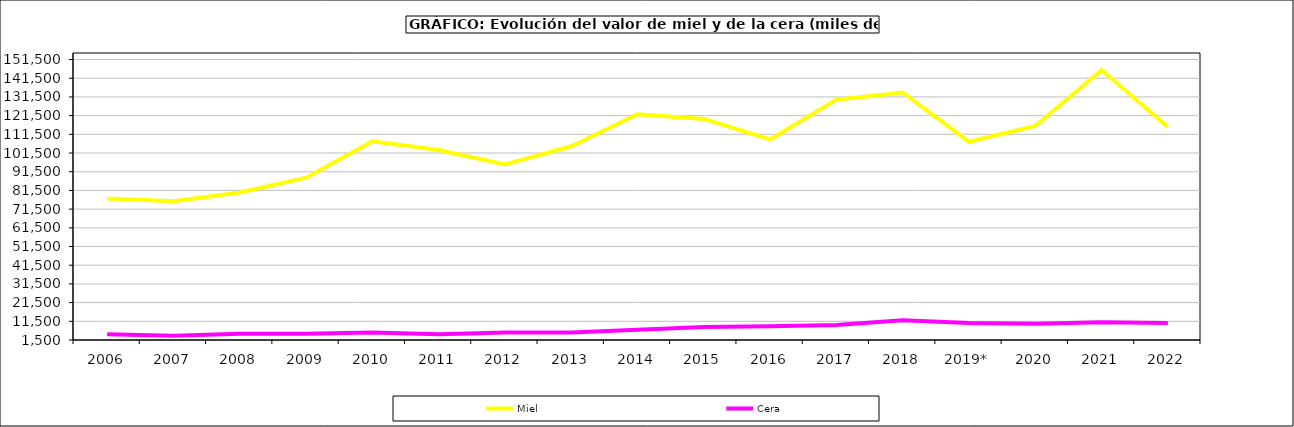
| Category | Miel | Cera |
|---|---|---|
| 2006 | 77210.535 | 4545.79 |
| 2007 | 75671.047 | 3782.043 |
| 2008 | 80408.918 | 4776.982 |
| 2009 | 88291.438 | 4877.522 |
| 2010 | 107827.095 | 5514.256 |
| 2011 | 103137.845 | 4533.385 |
| 2012 | 95366.296 | 5543.637 |
| 2013 | 105102.791 | 5553.321 |
| 2014 | 122217.175 | 7026.714 |
| 2015 | 119753.033 | 8392.273 |
| 2016 | 108750.281 | 8900.258 |
| 2017 | 130055.688 | 9514.815 |
| 2018 | 133889.869 | 12109.137 |
| 2019* | 107532.699 | 10532.872 |
| 2020 | 115975.21 | 10235.426 |
| 2021 | 145865.346 | 11002.183 |
| 2022 | 115419.621 | 10624.905 |